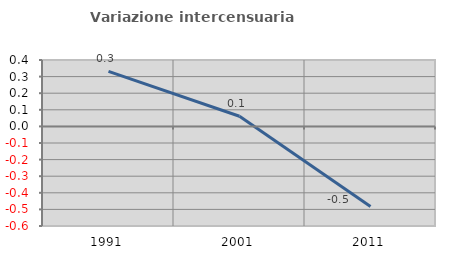
| Category | Variazione intercensuaria annua |
|---|---|
| 1991.0 | 0.331 |
| 2001.0 | 0.061 |
| 2011.0 | -0.482 |